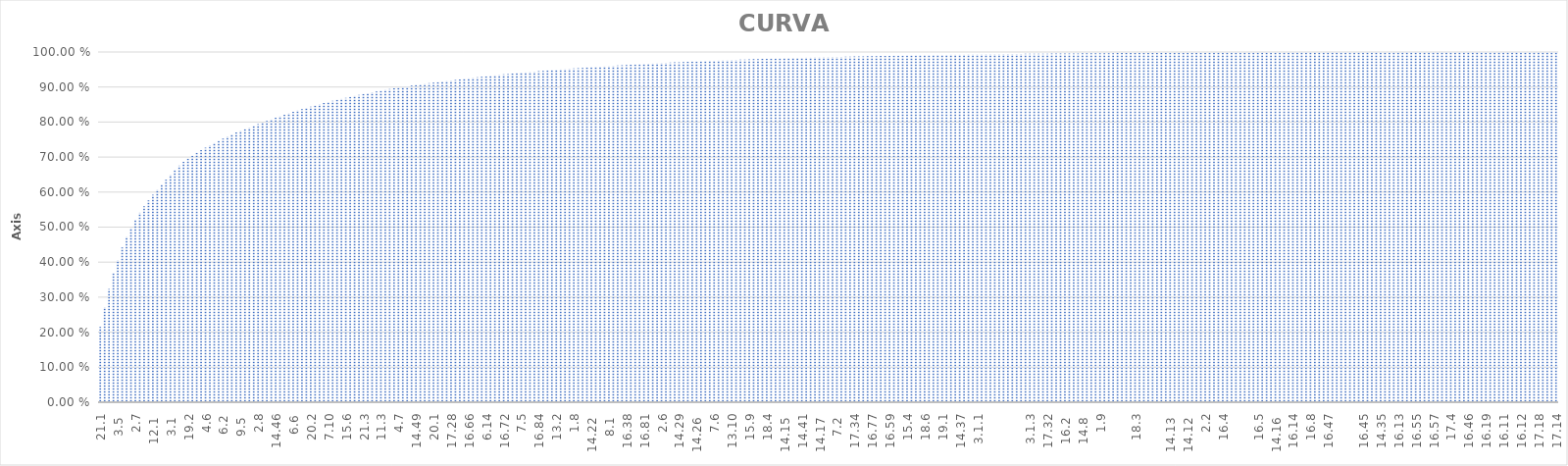
| Category | CURVA ABC |
|---|---|
| 21.1 | 0.215 |
|  9.1  | 0.271 |
|  1.11 | 0.323 |
|  9.2  | 0.369 |
|  3.5  | 0.406 |
| 21.2 | 0.442 |
|  5.1  | 0.472 |
| 6.9 | 0.497 |
|  2.7 | 0.521 |
|  4.3 | 0.541 |
|  2.5 | 0.559 |
| 6.1 | 0.576 |
|  12.1  | 0.593 |
|  4.4 | 0.607 |
|  3.3  | 0.621 |
|  12.3 | 0.635 |
|  3.1  | 0.649 |
|  4.1  | 0.663 |
| 22.1 | 0.676 |
|  1.3 | 0.686 |
| 19.2 | 0.696 |
| 13.7 | 0.704 |
| 19.3 | 0.712 |
| 13.9 | 0.72 |
|  4.6 | 0.727 |
|  | 0.734 |
|  1.1  | 0.74 |
| 22.1 | 0.747 |
| 6.2 | 0.753 |
|  1.10 | 0.759 |
|  11.2  | 0.765 |
| 20.9 | 0.77 |
|  9.5  | 0.775 |
| 13.6 | 0.78 |
|  1.5 | 0.785 |
| 19.8 | 0.789 |
|  2.8 | 0.794 |
|  11.6 | 0.799 |
|  16.73 | 0.803 |
| 6.10 | 0.808 |
|  14.46 | 0.812 |
| 20.8 | 0.817 |
| 6.12 | 0.821 |
| 19.6 | 0.825 |
| 6.6 | 0.829 |
| 13.4 | 0.833 |
|  15.5 | 0.837 |
|  | 0.84 |
| 20.2 | 0.844 |
|  3.2  | 0.847 |
|  11.1  | 0.851 |
|  4.2  | 0.854 |
|  7.10 | 0.857 |
| 13.8 | 0.86 |
|  9.3  | 0.863 |
| 19.7 | 0.866 |
|  15.6 | 0.869 |
|  3.4  | 0.872 |
|  4.5 | 0.875 |
| 13.1 | 0.878 |
| 21.3 | 0.88 |
| 13.11 | 0.883 |
|  7.4 | 0.885 |
|  14.30 | 0.887 |
|  11.3 | 0.89 |
| 18.10 | 0.892 |
|  16.80 | 0.894 |
|  5.4 | 0.896 |
|  4.7 | 0.898 |
|  14.23  | 0.9 |
|  14.43 | 0.902 |
|  14.44 | 0.904 |
|  14.49 | 0.906 |
|  15.1  | 0.908 |
| 6.4 | 0.909 |
|  8.3  | 0.911 |
| 20.1 | 0.913 |
|  14.11  | 0.914 |
|  3.7  | 0.916 |
|  7.3 | 0.917 |
| 17.28 | 0.919 |
|  | 0.92 |
|  14.42 | 0.922 |
|  14.47 | 0.923 |
|  16.66 | 0.925 |
|  1.2 | 0.926 |
|  7.1  | 0.928 |
|  5.3 | 0.929 |
| 6.14 | 0.931 |
|  5.2  | 0.932 |
| 12.2 | 0.933 |
|  2.4 | 0.935 |
|  16.72 | 0.936 |
|  11.4 | 0.937 |
|  16.67 | 0.939 |
|  14.14  | 0.94 |
|  7.5 | 0.941 |
|  10.3  | 0.942 |
|  16.40 | 0.943 |
|  16.60 | 0.944 |
|  16.84 | 0.945 |
|  | 0.946 |
|  16.78 | 0.947 |
|  14.31 | 0.948 |
| 13.2 | 0.949 |
|  14.27  | 0.95 |
|  14.45 | 0.951 |
|  7.8 | 0.952 |
|  1.8 | 0.953 |
| 6.3 | 0.954 |
|  16.61 | 0.955 |
|  1.6 | 0.956 |
|  14.22  | 0.956 |
| 20.3 | 0.957 |
|  15.3 | 0.958 |
|  9.4  | 0.959 |
|  8.1  | 0.96 |
| 6.13 | 0.96 |
| 19.9 | 0.961 |
|  3.6  | 0.962 |
|  16.38 | 0.963 |
|  14.48 | 0.963 |
| 19.4 | 0.964 |
|  1.7 | 0.965 |
|  16.81 | 0.966 |
|  | 0.966 |
| 20.5 | 0.967 |
| 17.1 | 0.968 |
|  2.6 | 0.968 |
|  11.7 | 0.969 |
| 20.6 | 0.97 |
|  1.4 | 0.97 |
|  14.29 | 0.971 |
| 20.4 | 0.971 |
|  10.4  | 0.972 |
|  16.39 | 0.972 |
|  14.26  | 0.973 |
| 6.5 | 0.973 |
|  14.4  | 0.974 |
|  | 0.975 |
|  7.6 | 0.975 |
|  16.79 | 0.976 |
| 17.22 | 0.976 |
|  8.2  | 0.977 |
| 13.10 | 0.977 |
|  14.3  | 0.977 |
|  16.75 | 0.978 |
|  16.7 | 0.978 |
|  15.9 | 0.979 |
| 6.8 | 0.979 |
|  16.37 | 0.98 |
|  | 0.98 |
| 18.4 | 0.981 |
|  14.9  | 0.981 |
|  16.71 | 0.981 |
| 20.10 | 0.982 |
|  14.15  | 0.982 |
| 6.11 | 0.983 |
|  15.2 | 0.983 |
| 17.31 | 0.983 |
|  14.41 | 0.984 |
|  16.74 | 0.984 |
| 13.5 | 0.984 |
|  | 0.984 |
|  14.17  | 0.985 |
| 6.7 | 0.985 |
| 3.1.2 | 0.985 |
| 3.1.5 | 0.986 |
|  7.2  | 0.986 |
|  10.1  | 0.986 |
| 17.37 | 0.987 |
|  14.7  | 0.987 |
| 17.34 | 0.987 |
| 13.3 | 0.987 |
| 17.26 | 0.988 |
|  10.2  | 0.988 |
|  16.77 | 0.988 |
|  2.1  | 0.988 |
| 17.30 | 0.989 |
|  2.3 | 0.989 |
|  16.59 | 0.989 |
|  16.36 | 0.989 |
| 18.8 | 0.99 |
|  14.25  | 0.99 |
|  15.4 | 0.99 |
|  15.7 | 0.99 |
|  16.6 | 0.99 |
| 18.5 | 0.991 |
| 18.6 | 0.991 |
| 3.1.6 | 0.991 |
|  14.2  | 0.991 |
|  15.8 | 0.991 |
| 19.1 | 0.992 |
|  11.5 | 0.992 |
|  14.33 | 0.992 |
|  14.32 | 0.992 |
|  14.37 | 0.992 |
|  14.39 | 0.993 |
|  16.3 | 0.993 |
| 18.2 | 0.993 |
| 3.1.1 | 0.993 |
|  16.41 | 0.993 |
| 3.1.7 | 0.993 |
|  14.6  | 0.994 |
|  | 0.994 |
|  14.1  | 0.994 |
|  | 0.994 |
|  14.18  | 0.994 |
|  | 0.994 |
| 18.9 | 0.995 |
| 18.1 | 0.995 |
|  14.10  | 0.995 |
| 3.1.3 | 0.995 |
|  7.7 | 0.995 |
|  16.42 | 0.995 |
|  | 0.995 |
| 17.32 | 0.995 |
|  16.63 | 0.996 |
|  16.85 | 0.996 |
| 18.7 | 0.996 |
|  16.2  | 0.996 |
|  16.65 | 0.996 |
|  16.70 | 0.996 |
|  16.44 | 0.996 |
|  14.8  | 0.996 |
|  16.86 | 0.996 |
|  16.16 | 0.996 |
|  7.9 | 0.997 |
|  1.9 | 0.997 |
|  16.87 | 0.997 |
|  16.76 | 0.997 |
|  16.82 | 0.997 |
|  | 0.997 |
|  14.38 | 0.997 |
|  16.15 | 0.997 |
| 17.23 | 0.997 |
| 18.3 | 0.997 |
|  16.35 | 0.997 |
|  16.43 | 0.997 |
|  14.34 | 0.997 |
|  | 0.997 |
|  16.62 | 0.998 |
| 17.2 | 0.998 |
|  14.21  | 0.998 |
|  14.13  | 0.998 |
|  | 0.998 |
| 17.24 | 0.998 |
|  16.58 | 0.998 |
|  14.12  | 0.998 |
|  16.68 | 0.998 |
|  14.40 | 0.998 |
|  16.56 | 0.998 |
|  2.2 | 0.998 |
|  | 0.998 |
|  16.33 | 0.998 |
|  16.50 | 0.998 |
|  16.4 | 0.998 |
|  | 0.998 |
| 3.1.4 | 0.998 |
|  14.19  | 0.998 |
|  | 0.999 |
|  16.26 | 0.999 |
|  16.1  | 0.999 |
|  16.53 | 0.999 |
|  16.5 | 0.999 |
|  16.24 | 0.999 |
|  | 0.999 |
|  | 0.999 |
|  14.16  | 0.999 |
|  16.64 | 0.999 |
|  16.52 | 0.999 |
| 17.11 | 0.999 |
|  16.14 | 0.999 |
|  16.10 | 0.999 |
|  16.27 | 0.999 |
|  14.36 | 0.999 |
|  16.8 | 0.999 |
|  | 0.999 |
| 17.21 | 0.999 |
|  16.30 | 0.999 |
|  16.47 | 0.999 |
|  16.49 | 0.999 |
| 17.25 | 0.999 |
|  16.54 | 0.999 |
|  | 0.999 |
|  16.51 | 0.999 |
|  14.24  | 0.999 |
| 19.5 | 0.999 |
|  16.45 | 0.999 |
|  14.28 | 0.999 |
| 17.6 | 1 |
|  16.48 | 1 |
|  14.35 | 1 |
|  16.29 | 1 |
| 17.13 | 1 |
| 17.20 | 1 |
|  16.13 | 1 |
|  14.5  | 1 |
|  16.31 | 1 |
|  14.20  | 1 |
|  16.55 | 1 |
|  16.83 | 1 |
|  16.18 | 1 |
| 20.7 | 1 |
|  16.57 | 1 |
|  16.69 | 1 |
|  16.25 | 1 |
| 17.3 | 1 |
| 17.4 | 1 |
|  16.23 | 1 |
|  16.28 | 1 |
| 17.27 | 1 |
|  16.46 | 1 |
|  16.17 | 1 |
| 17.7 | 1 |
| 17.29 | 1 |
|  16.19 | 1 |
| 17.5 | 1 |
|  16.21 | 1 |
|  16.22 | 1 |
|  16.11 | 1 |
|  16.34 | 1 |
|  16.20 | 1 |
|  16.9 | 1 |
|  16.12 | 1 |
| 17.15 | 1 |
| 17.17 | 1 |
|  16.32 | 1 |
| 17.18 | 1 |
| 17.16 | 1 |
| 17.19 | 1 |
| 17.12 | 1 |
| 17.14 | 1 |